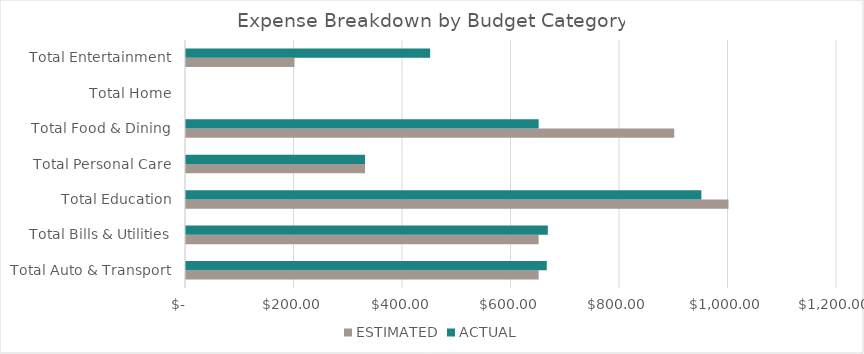
| Category | ESTIMATED | ACTUAL |
|---|---|---|
| Total Auto & Transport | 650 | 665 |
| Total Bills & Utilities | 650 | 667 |
| Total Education | 1000 | 950 |
| Total Personal Care | 330 | 330 |
| Total Food & Dining | 900 | 650 |
| Total Home | 0 | 0 |
| Total Entertainment | 200 | 450 |